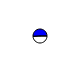
| Category | Series 0 |
|---|---|
| 0 | 7847 |
| 1 | 8111 |